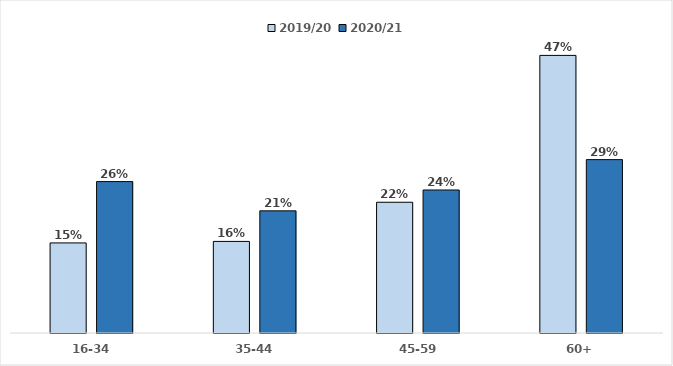
| Category | 2019/20 | 2020/21 |
|---|---|---|
| 16-34 | 0.153 | 0.257 |
| 35-44 | 0.155 | 0.207 |
| 45-59 | 0.222 | 0.242 |
| 60+ | 0.471 | 0.294 |